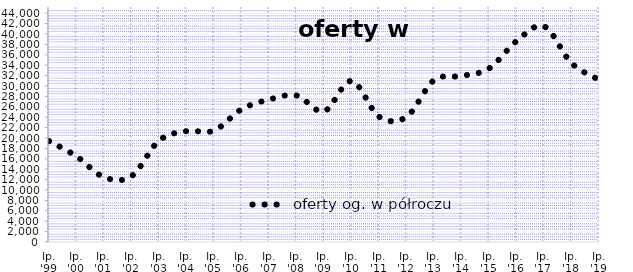
| Category | oferty og. w półroczu |
|---|---|
| Ip. '99 | 19411 |
| Ip. '00 | 16479 |
| Ip. '01 | 12461 |
| Ip. '02 | 12658 |
| Ip. '03 | 19490 |
| Ip. '04 | 21329 |
| Ip. '05 | 21427 |
| Ip. '06 | 25517 |
| Ip. '07 | 27392 |
| Ip. '08 | 28169 |
| Ip. '09 | 25139 |
| Ip. '10 | 30966 |
| Ip. '11 | 24104 |
| Ip. '12 | 24066 |
| Ip. '13 | 31113 |
| Ip. '14 | 31924 |
| Ip. '15 | 33364 |
| Ip. '16 | 38617 |
| Ip. '17 | 41480 |
| Ip. '18 | 34404 |
| Ip. '19 | 31188 |